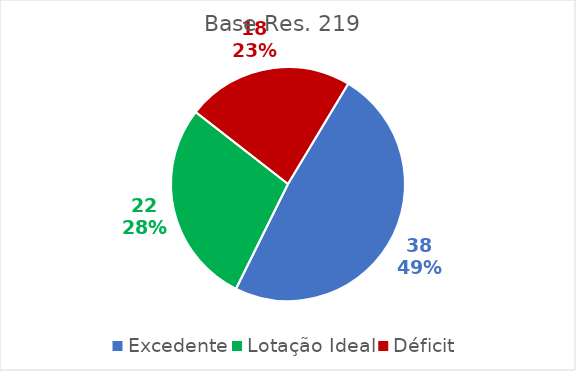
| Category | LP |
|---|---|
| Excedente | 38 |
| Lotação Ideal | 22 |
| Déficit | 18 |